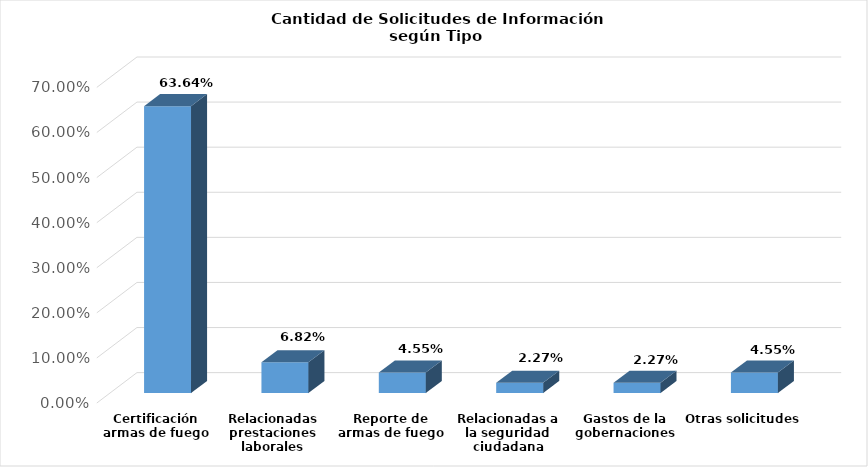
| Category | Series 0 |
|---|---|
| Certificación armas de fuego | 0.636 |
| Relacionadas prestaciones laborales | 0.068 |
| Reporte de armas de fuego | 0.045 |
| Relacionadas a la seguridad ciudadana | 0.023 |
| Gastos de la gobernaciones | 0.023 |
| Otras solicitudes | 0.045 |